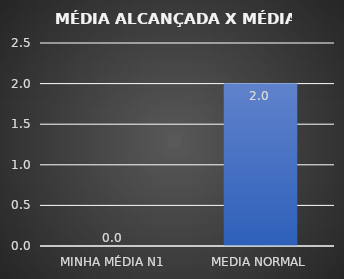
| Category | Series 0 |
|---|---|
| MINHA MÉDIA N1 | 0 |
| MEDIA NORMAL | 2 |